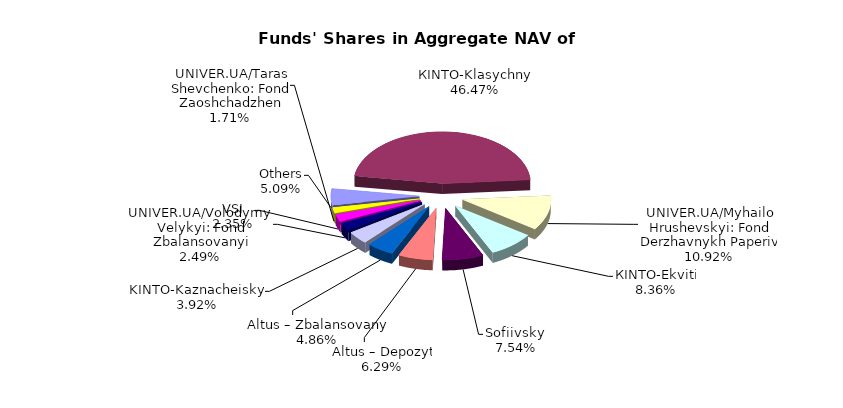
| Category | Series 0 | Series 1 |
|---|---|---|
| Others | 3416762.96 | 0.051 |
| КІNТО-Klasychnyi | 31184027.42 | 0.465 |
| UNIVER.UA/Myhailo Hrushevskyi: Fond Derzhavnykh Paperiv | 7327633.97 | 0.109 |
| КІNTO-Ekviti | 5611020.265 | 0.084 |
| Sofiivskyi | 5061828.5 | 0.075 |
| Altus – Depozyt | 4218342.59 | 0.063 |
| Altus – Zbalansovanyi | 3259539.61 | 0.049 |
| KINTO-Kaznacheiskyi | 2628770.92 | 0.039 |
| UNIVER.UA/Volodymyr Velykyi: Fond Zbalansovanyi | 1673024.11 | 0.025 |
| VSI | 1577632.18 | 0.024 |
| UNIVER.UA/Taras Shevchenko: Fond Zaoshchadzhen | 1147414.98 | 0.017 |